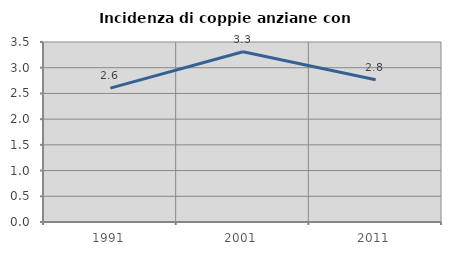
| Category | Incidenza di coppie anziane con figli |
|---|---|
| 1991.0 | 2.603 |
| 2001.0 | 3.312 |
| 2011.0 | 2.767 |